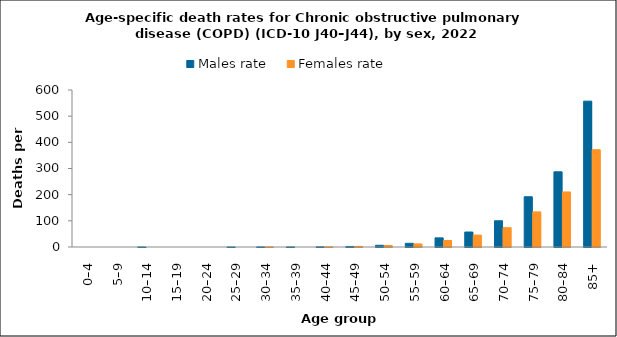
| Category | Males rate | Females rate |
|---|---|---|
| 0–4 | 0 | 0 |
| 5–9 | 0 | 0 |
| 10–14 | 0.119 | 0 |
| 15–19 | 0 | 0 |
| 20–24 | 0 | 0 |
| 25–29 | 0.108 | 0 |
| 30–34 | 0.211 | 0.103 |
| 35–39 | 0.213 | 0 |
| 40–44 | 0.594 | 0.348 |
| 45–49 | 2.117 | 2.197 |
| 50–54 | 6.512 | 5.954 |
| 55–59 | 14.181 | 11.791 |
| 60–64 | 34.871 | 24.905 |
| 65–69 | 57.228 | 45.588 |
| 70–74 | 100.152 | 73.77 |
| 75–79 | 192.036 | 134.09 |
| 80–84 | 287.376 | 210.363 |
| 85+ | 557.412 | 371.802 |